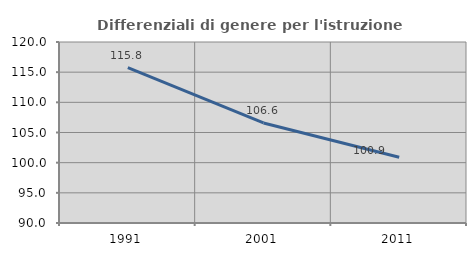
| Category | Differenziali di genere per l'istruzione superiore |
|---|---|
| 1991.0 | 115.758 |
| 2001.0 | 106.585 |
| 2011.0 | 100.91 |